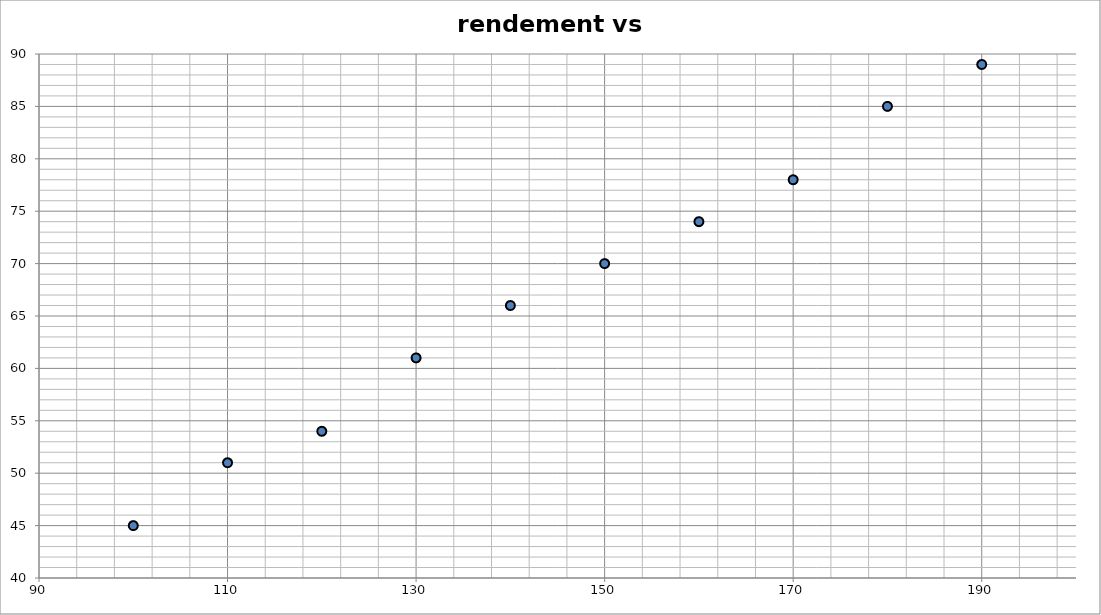
| Category | données |
|---|---|
| 100.0 | 45 |
| 110.0 | 51 |
| 120.0 | 54 |
| 130.0 | 61 |
| 140.0 | 66 |
| 150.0 | 70 |
| 160.0 | 74 |
| 170.0 | 78 |
| 180.0 | 85 |
| 190.0 | 89 |